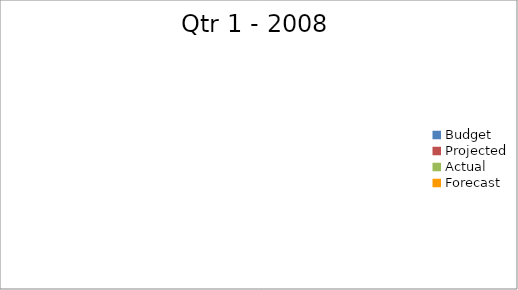
| Category | Series 0 |
|---|---|
| Budget | 1200 |
| Projected | 2410 |
| Actual | 1770 |
| Forecast | 3200 |